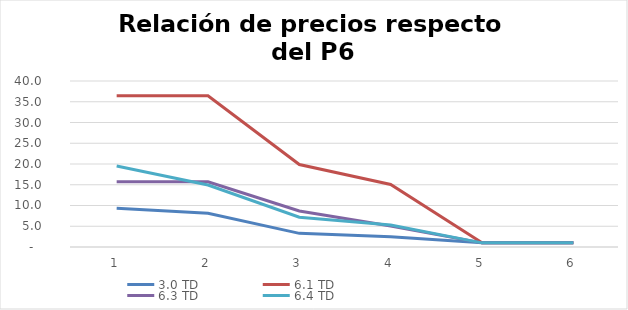
| Category | 3.0 TD | 6.1 TD | 6.3 TD | 6.4 TD |
|---|---|---|---|---|
| 0 | 9.346 | 36.456 | 15.703 | 19.53 |
| 1 | 8.151 | 36.456 | 15.703 | 14.947 |
| 2 | 3.285 | 19.876 | 8.686 | 7.19 |
| 3 | 2.496 | 15.055 | 5.079 | 5.293 |
| 4 | 1 | 1 | 1 | 1 |
| 5 | 1 | 1 | 1 | 1 |